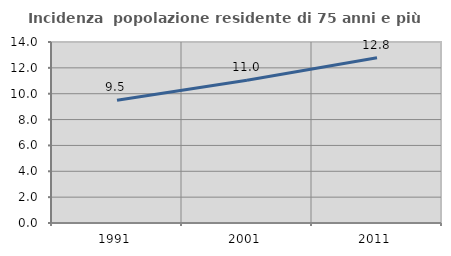
| Category | Incidenza  popolazione residente di 75 anni e più |
|---|---|
| 1991.0 | 9.494 |
| 2001.0 | 11.048 |
| 2011.0 | 12.79 |